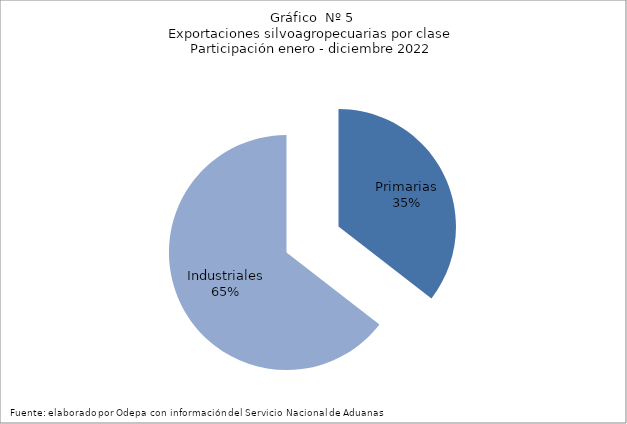
| Category | Series 0 |
|---|---|
| Primarias | 6592821 |
| Industriales | 11990627 |